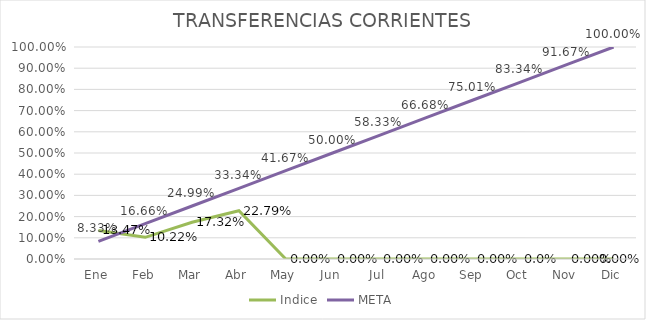
| Category | Indice | META |
|---|---|---|
| Ene | 0.135 | 0.083 |
| Feb | 0.102 | 0.167 |
| Mar | 0.173 | 0.25 |
| Abr | 0.228 | 0.333 |
| May | 0 | 0.417 |
| Jun | 0 | 0.5 |
| Jul | 0 | 0.583 |
| Ago | 0 | 0.667 |
| Sep | 0 | 0.75 |
| Oct | 0 | 0.833 |
| Nov | 0 | 0.917 |
| Dic | 0 | 1 |